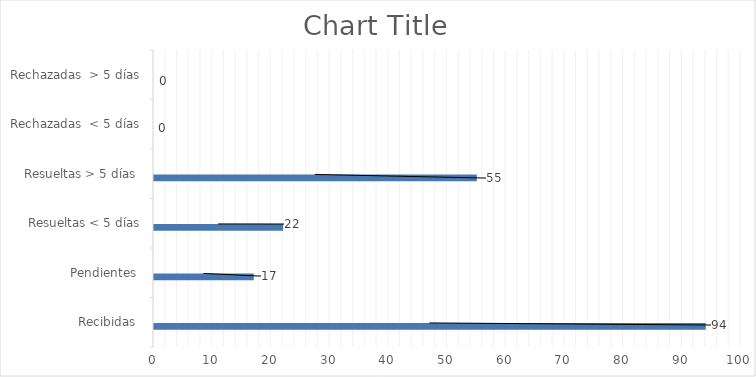
| Category | Física | PORTAL SAIP | 311 | Otras |
|---|---|---|---|---|
| Recibidas  | 0 | 94 | 0 | 0 |
| Pendientes  | 0 | 17 | 0 | 0 |
| Resueltas < 5 días | 0 | 22 | 0 | 0 |
| Resueltas > 5 días  | 0 | 55 | 0 | 0 |
| Rechazadas  < 5 días | 0 | 0 | 0 | 0 |
| Rechazadas  > 5 días | 0 | 0 | 0 | 0 |